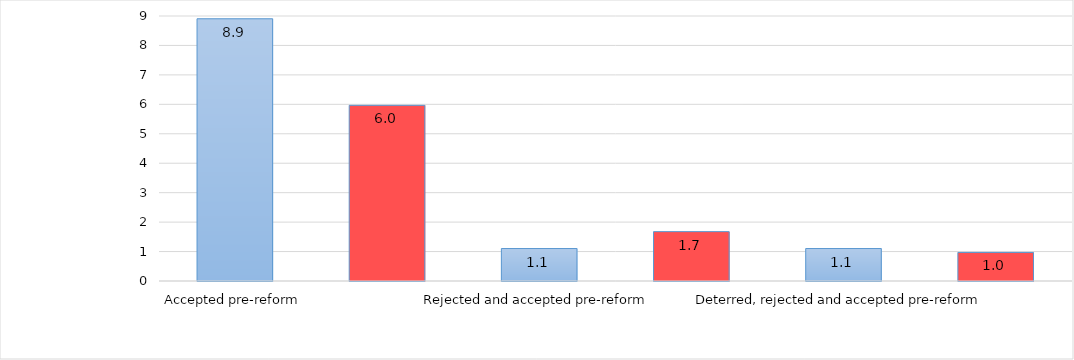
| Category | Series 0 |
|---|---|
| Accepted pre-reform | 8.906 |
| Accepted post-reform | 5.966 |
| Rejected and accepted pre-reform | 1.103 |
| Rejected and accepted post-reform | 1.677 |
| Deterred, rejected and accepted pre-reform | 1.103 |
| Deterred, rejected and accepted post-reform | 0.97 |